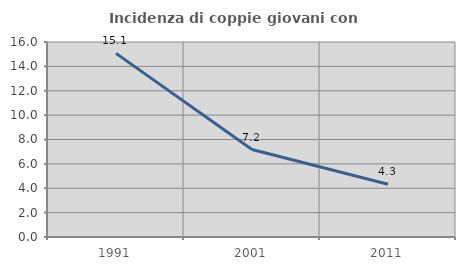
| Category | Incidenza di coppie giovani con figli |
|---|---|
| 1991.0 | 15.068 |
| 2001.0 | 7.175 |
| 2011.0 | 4.329 |